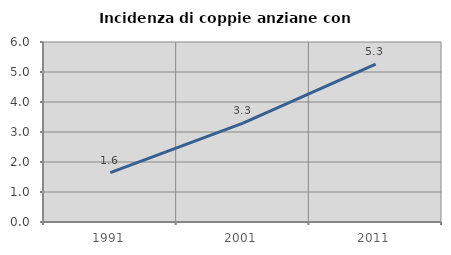
| Category | Incidenza di coppie anziane con figli |
|---|---|
| 1991.0 | 1.644 |
| 2001.0 | 3.299 |
| 2011.0 | 5.264 |